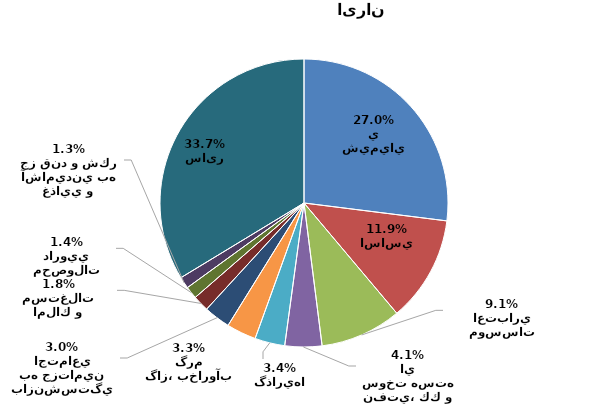
| Category | درصد از كل |
|---|---|
| محصولات شيميايي | 0.27 |
| فلزات اساسي | 0.119 |
| بانكها و موسسات اعتباري | 0.091 |
| فراورده هاي نفتي، كك و سوخت هسته اي | 0.041 |
| سرمايه گذاريها | 0.034 |
| عرضه برق، گاز، بخاروآب گرم | 0.033 |
| بيمه وصندوق بازنشستگي به جزتامين اجتماعي | 0.03 |
| انبوه سازي، املاك و مستغلات | 0.018 |
| مواد و محصولات دارويي | 0.014 |
| محصولات غذايي و آشاميدني به جز قند و شكر | 0.013 |
| سایر | 0.337 |